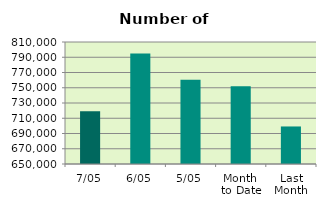
| Category | Series 0 |
|---|---|
| 7/05 | 719302 |
| 6/05 | 795038 |
| 5/05 | 760364 |
| Month 
to Date | 752045.2 |
| Last
Month | 699227 |